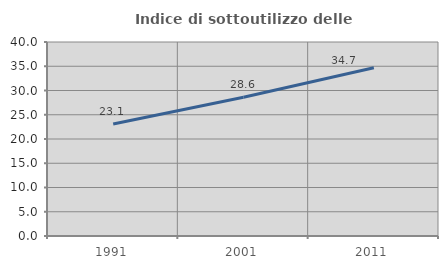
| Category | Indice di sottoutilizzo delle abitazioni  |
|---|---|
| 1991.0 | 23.102 |
| 2001.0 | 28.616 |
| 2011.0 | 34.703 |